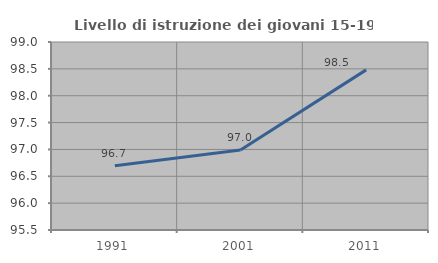
| Category | Livello di istruzione dei giovani 15-19 anni |
|---|---|
| 1991.0 | 96.696 |
| 2001.0 | 96.988 |
| 2011.0 | 98.481 |